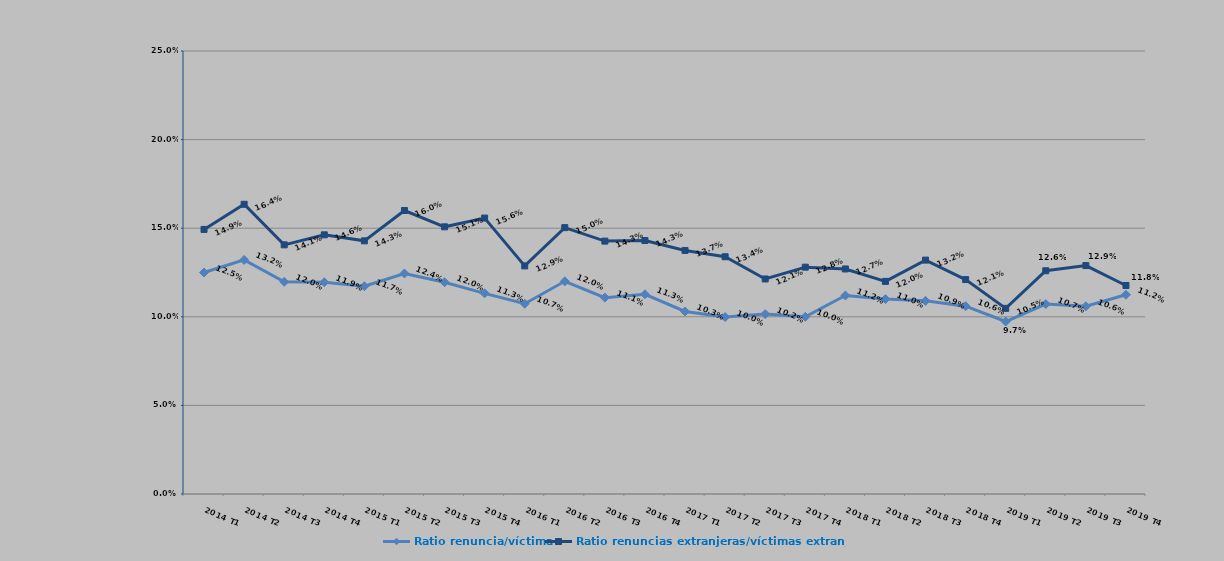
| Category | Ratio renuncia/víctima | Ratio renuncias extranjeras/víctimas extranjeras |
|---|---|---|
| 2014 T1 | 0.125 | 0.149 |
| 2014 T2 | 0.132 | 0.164 |
| 2014 T3 | 0.12 | 0.141 |
| 2014 T4 | 0.119 | 0.146 |
| 2015 T1 | 0.117 | 0.143 |
| 2015 T2 | 0.124 | 0.16 |
| 2015 T3 | 0.12 | 0.151 |
| 2015 T4 | 0.113 | 0.156 |
| 2016 T1 | 0.107 | 0.129 |
| 2016 T2 | 0.12 | 0.15 |
| 2016 T3 | 0.111 | 0.143 |
| 2016 T4 | 0.113 | 0.143 |
| 2017 T1 | 0.103 | 0.137 |
| 2017 T2 | 0.1 | 0.134 |
| 2017 T3 | 0.102 | 0.121 |
| 2017 T4 | 0.1 | 0.128 |
| 2018 T1 | 0.112 | 0.127 |
| 2018 T2 | 0.11 | 0.12 |
| 2018 T3 | 0.109 | 0.132 |
| 2018 T4 | 0.106 | 0.121 |
| 2019 T1 | 0.097 | 0.105 |
| 2019 T2 | 0.107 | 0.126 |
| 2019 T3 | 0.106 | 0.129 |
| 2019 T4 | 0.112 | 0.118 |